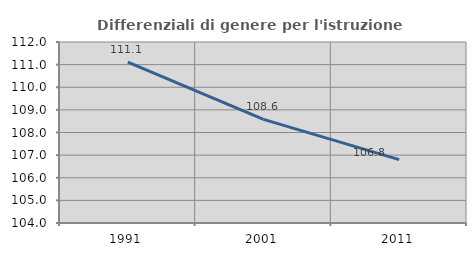
| Category | Differenziali di genere per l'istruzione superiore |
|---|---|
| 1991.0 | 111.115 |
| 2001.0 | 108.582 |
| 2011.0 | 106.8 |